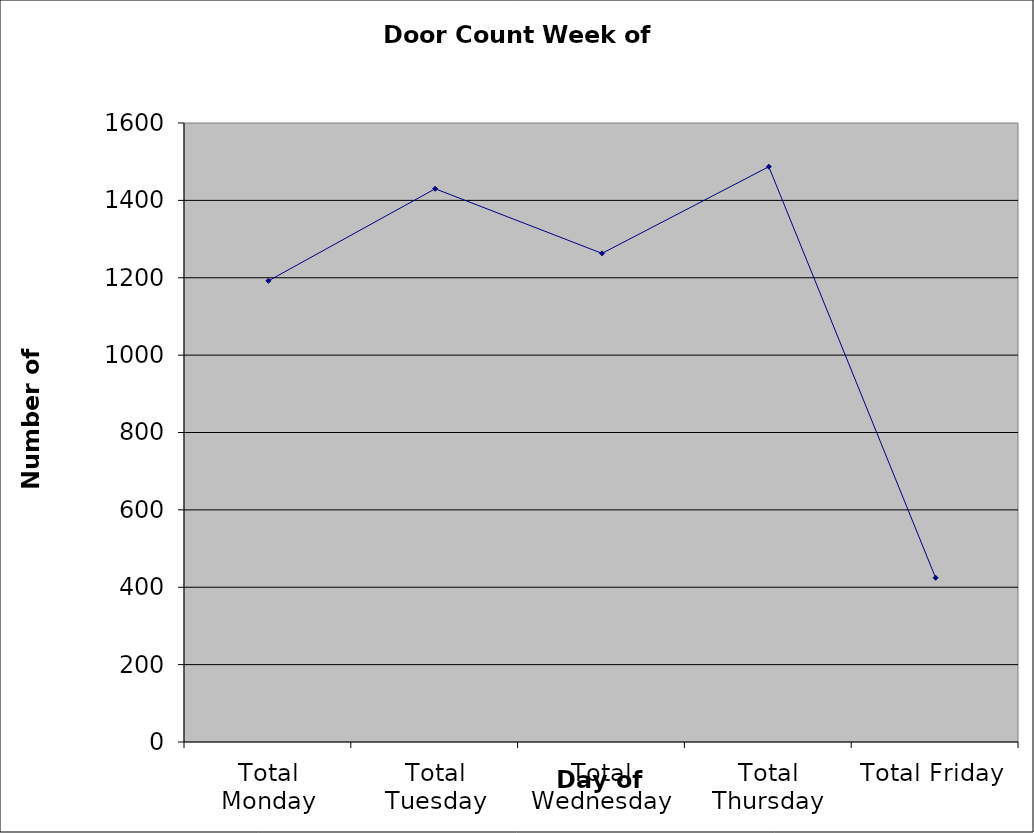
| Category | Series 0 |
|---|---|
| Total Monday | 1192 |
| Total Tuesday | 1430 |
| Total Wednesday | 1263 |
| Total Thursday | 1487 |
| Total Friday | 424.5 |